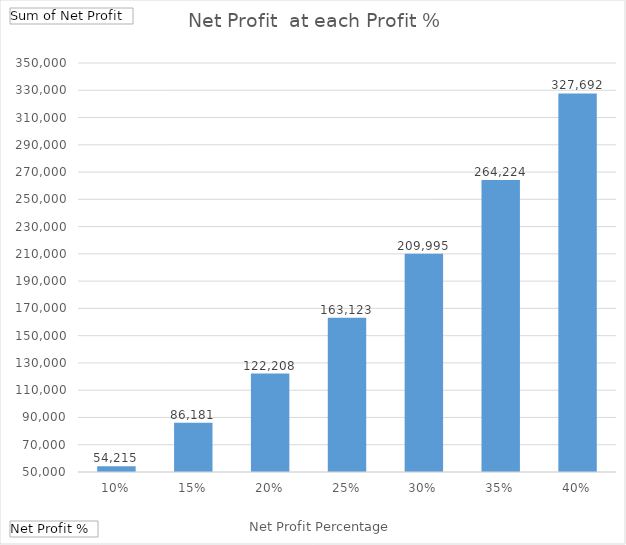
| Category | Total |
|---|---|
| 10% | 54215.047 |
| 15% | 86180.549 |
| 20% | 122207.742 |
| 25% | 163123.292 |
| 30% | 209994.526 |
| 35% | 264223.881 |
| 40% | 327691.628 |